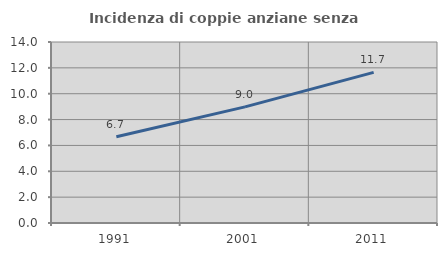
| Category | Incidenza di coppie anziane senza figli  |
|---|---|
| 1991.0 | 6.677 |
| 2001.0 | 8.981 |
| 2011.0 | 11.651 |